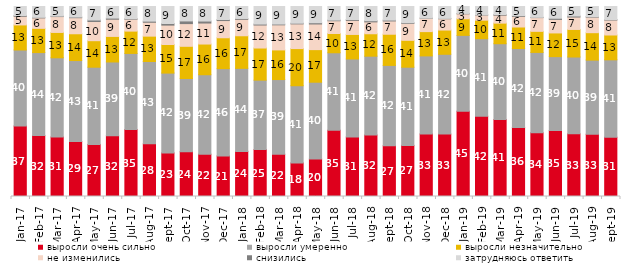
| Category | выросли очень сильно | выросли умеренно | выросли незначительно | не изменились | снизились | затрудняюсь ответить |
|---|---|---|---|---|---|---|
| 2017-01-01 | 37.15 | 39.95 | 13.2 | 4.55 | 0.4 | 4.75 |
| 2017-02-01 | 32.05 | 43.7 | 12.75 | 5.5 | 0.3 | 5.7 |
| 2017-03-01 | 31.3 | 41.7 | 13.35 | 8.35 | 0.25 | 5.05 |
| 2017-04-01 | 28.95 | 42.6 | 14.1 | 8.45 | 0.35 | 5.55 |
| 2017-05-01 | 27.4 | 40.65 | 13.95 | 10.1 | 0.8 | 7.1 |
| 2017-06-01 | 31.95 | 38.85 | 13.45 | 9.05 | 0.6 | 6.1 |
| 2017-07-01 | 35.25 | 40.05 | 11.75 | 6.25 | 0.25 | 6.45 |
| 2017-08-01 | 27.7 | 43.35 | 13.35 | 7.3 | 0.6 | 7.7 |
| 2017-09-01 | 22.95 | 42 | 15.05 | 10.2 | 0.85 | 8.95 |
| 2017-10-01 | 23.6 | 38.5 | 16.95 | 11.95 | 1.4 | 7.6 |
| 2017-11-01 | 22.25 | 41.8 | 16.15 | 11.05 | 1.05 | 7.65 |
| 2017-12-01 | 21.35 | 45.95 | 16.25 | 9.05 | 0.55 | 6.85 |
| 2018-01-01 | 23.75 | 43.7 | 17.15 | 8.65 | 0.45 | 6.3 |
| 2018-02-01 | 24.7 | 36.55 | 16.9 | 12.1 | 0.5 | 9.25 |
| 2018-03-01 | 22.25 | 39.3 | 15.6 | 13.2 | 0.4 | 9.25 |
| 2018-04-01 | 17.65 | 40.65 | 19.55 | 13 | 0.35 | 8.8 |
| 2018-05-01 | 19.75 | 40.4 | 17.15 | 13.5 | 0.65 | 8.55 |
| 2018-06-01 | 34.85 | 40.8 | 10.15 | 6.7 | 0.35 | 7.15 |
| 2018-07-01 | 31.3 | 41.05 | 12.9 | 7.4 | 0.45 | 6.85 |
| 2018-08-01 | 32.35 | 41.5 | 11.8 | 6.25 | 0.6 | 7.5 |
| 2018-09-01 | 26.7 | 42.3 | 16.4 | 7 | 0.45 | 7.15 |
| 2018-10-01 | 26.9 | 41.15 | 14.15 | 8.9 | 0.35 | 8.55 |
| 2018-11-01 | 32.934 | 41.068 | 12.774 | 7.036 | 0.1 | 6.088 |
| 2018-12-01 | 32.85 | 42 | 12.75 | 5.95 | 0.2 | 6.25 |
| 2019-01-01 | 44.85 | 39.95 | 8.75 | 2.6 | 0.2 | 3.65 |
| 2019-02-01 | 42.2 | 40.85 | 9.75 | 2.7 | 0.1 | 4.4 |
| 2019-03-01 | 40.527 | 39.881 | 10.84 | 4.177 | 0.348 | 4.227 |
| 2019-04-01 | 36.337 | 41.535 | 11.337 | 5.594 | 0.396 | 4.802 |
| 2019-05-01 | 33.531 | 42.298 | 11.095 | 7.231 | 0.149 | 5.696 |
| 2019-06-01 | 34.763 | 38.853 | 12.469 | 7.132 | 0.599 | 6.185 |
| 2019-07-01 | 32.97 | 40.446 | 14.505 | 6.535 | 0.545 | 5 |
| 2019-08-01 | 32.767 | 39.011 | 14.436 | 8.192 | 0.25 | 5.345 |
| 2019-09-01 | 31.188 | 40.743 | 13.069 | 7.871 | 0.248 | 6.881 |